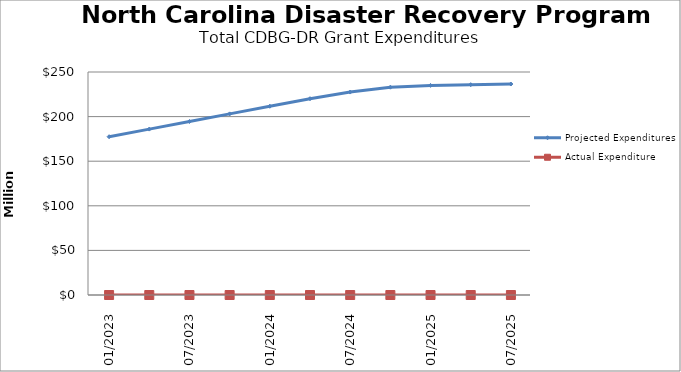
| Category | Projected Expenditures | Actual Expenditure |
|---|---|---|
| 01/2023 | 177451699.985 | 0 |
| 4/2023 | 185985768.985 | 0 |
| 07/2023 | 194519839.985 | 0 |
| 10/2023 | 203053910.985 | 0 |
| 01/2024 | 211614759.985 | 0 |
| 4/2024 | 220068830.985 | 0 |
| 07/2024 | 227522901.985 | 0 |
| 10/2024 | 232976972.985 | 0 |
| 01/2025 | 234976972.985 | 0 |
| 4/2025 | 235771890.985 | 0 |
| 07/2025 | 236528999.985 | 0 |